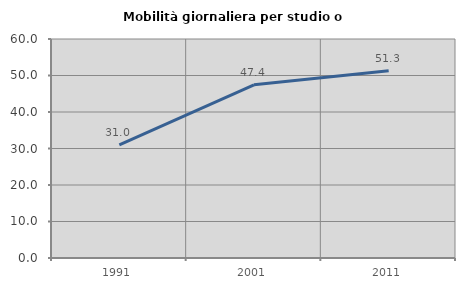
| Category | Mobilità giornaliera per studio o lavoro |
|---|---|
| 1991.0 | 31 |
| 2001.0 | 47.436 |
| 2011.0 | 51.304 |